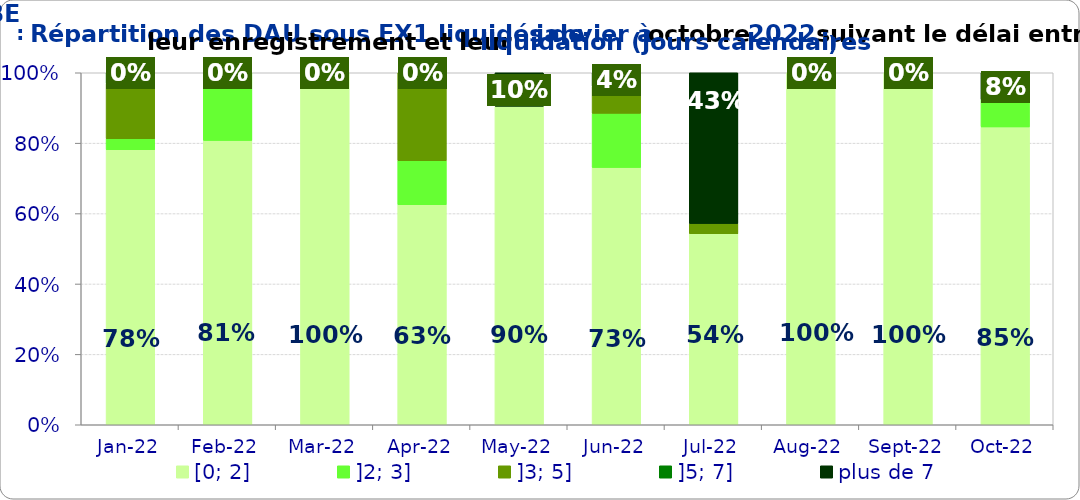
| Category | [0; 2] | ]2; 3] | ]3; 5] | ]5; 7] | plus de 7 |
|---|---|---|---|---|---|
| 2022-01-01 | 0.781 | 0.031 | 0.156 | 0.031 | 0 |
| 2022-02-01 | 0.808 | 0.192 | 0 | 0 | 0 |
| 2022-03-01 | 1 | 0 | 0 | 0 | 0 |
| 2022-04-01 | 0.625 | 0.125 | 0.25 | 0 | 0 |
| 2022-05-01 | 0.905 | 0 | 0 | 0 | 0.095 |
| 2022-06-01 | 0.731 | 0.154 | 0.077 | 0 | 0.038 |
| 2022-07-01 | 0.543 | 0 | 0.029 | 0 | 0.429 |
| 2022-08-01 | 1 | 0 | 0 | 0 | 0 |
| 2022-09-01 | 1 | 0 | 0 | 0 | 0 |
| 2022-10-01 | 0.846 | 0.077 | 0 | 0 | 0.077 |